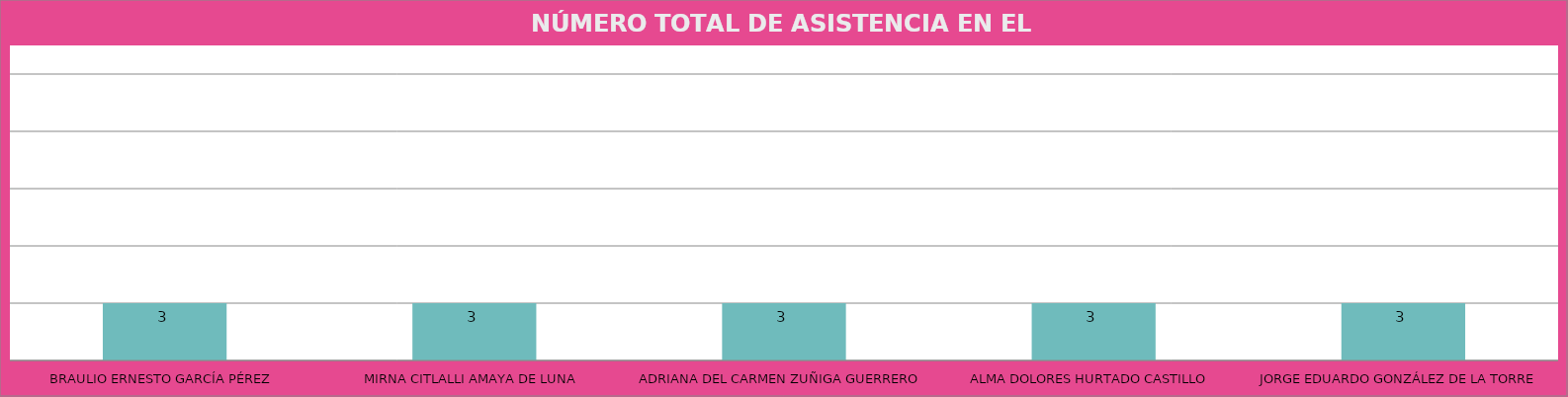
| Category | BRAULIO ERNESTO GARCÍA PÉREZ |
|---|---|
| BRAULIO ERNESTO GARCÍA PÉREZ | 3 |
| MIRNA CITLALLI AMAYA DE LUNA | 3 |
| ADRIANA DEL CARMEN ZUÑIGA GUERRERO | 3 |
| ALMA DOLORES HURTADO CASTILLO | 3 |
| JORGE EDUARDO GONZÁLEZ DE LA TORRE | 3 |